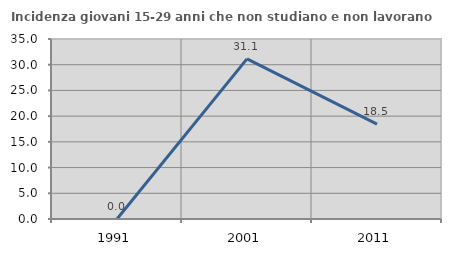
| Category | Incidenza giovani 15-29 anni che non studiano e non lavorano  |
|---|---|
| 1991.0 | 0 |
| 2001.0 | 31.132 |
| 2011.0 | 18.462 |